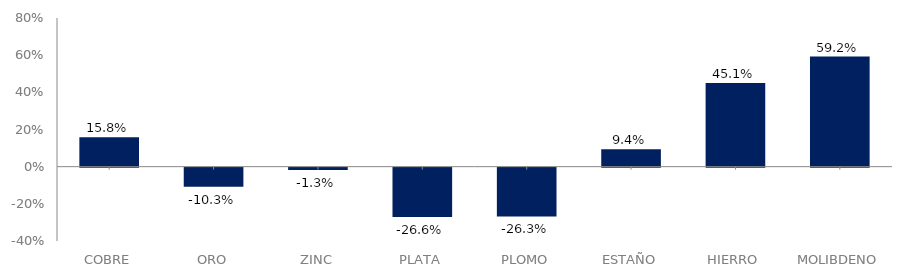
| Category | Series 0 |
|---|---|
| COBRE | 0.158 |
| ORO | -0.103 |
| ZINC | -0.013 |
| PLATA | -0.266 |
| PLOMO | -0.263 |
| ESTAÑO | 0.094 |
| HIERRO | 0.451 |
| MOLIBDENO | 0.592 |